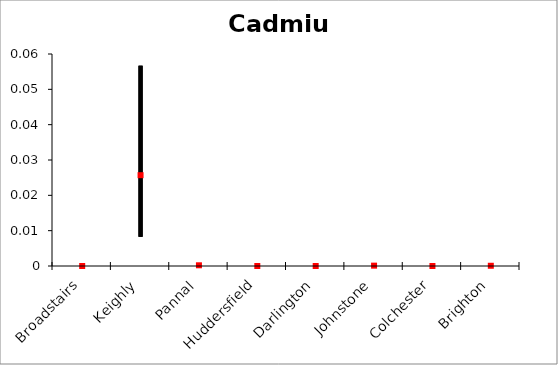
| Category | Cadmium | Series 1 | Series 2 |
|---|---|---|---|
| Broadstairs | 0 | 0 | 0 |
| Keighly | 0.057 | 0.008 | 0.026 |
| Pannal | 0.001 | 0 | 0 |
| Huddersfield | 0 | 0 | 0 |
| Darlington | 0 | 0 | 0 |
| Johnstone | 0 | 0 | 0 |
| Colchester | 0.001 | 0 | 0 |
| Brighton | 0 | 0 | 0 |